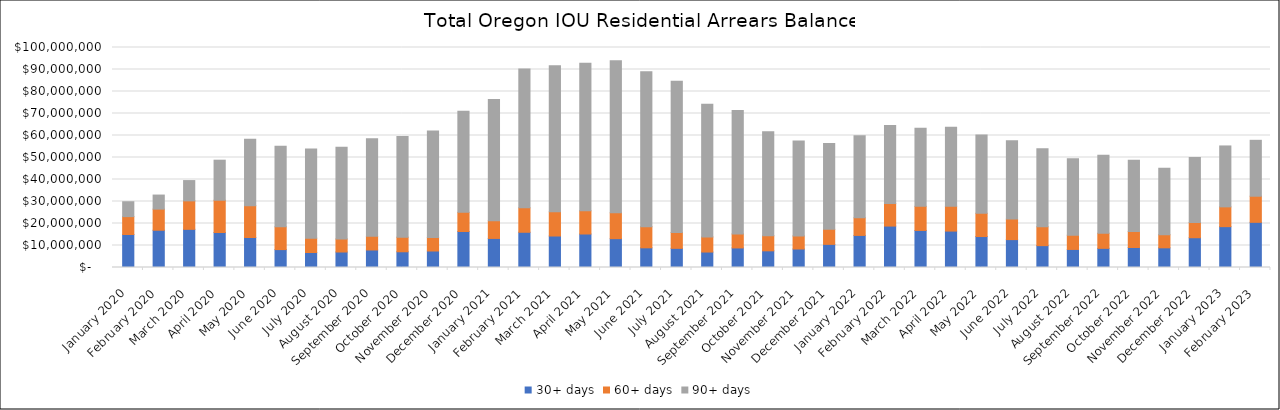
| Category | 30+ days | 60+ days | 90+ days |
|---|---|---|---|
| 2020-01-01 | 14999552.31 | 8129105.13 | 6760749.68 |
| 2020-02-01 | 16930804.68 | 9608883.66 | 6388004.87 |
| 2020-03-01 | 17347180.46 | 12945947.11 | 9217183.92 |
| 2020-04-01 | 15918330.54 | 14656978.15 | 18202643.15 |
| 2020-05-01 | 13635646.16 | 14480206.66 | 30139370.36 |
| 2020-06-01 | 8143670.76 | 10339556.26 | 36607516.53 |
| 2020-07-01 | 6807663.49 | 6543664.8 | 40561852.84 |
| 2020-08-01 | 7043775.37 | 5937688.4 | 41691741.28 |
| 2020-09-01 | 7956477.38 | 6224781.42 | 44287595.16 |
| 2020-10-01 | 7149177.07 | 6636657.67 | 45739306.85 |
| 2020-11-01 | 7497623.31 | 6094228.87 | 48474848.41 |
| 2020-12-01 | 16371314.19 | 8704218.41 | 45908006.23 |
| 2021-01-01 | 13214270.68 | 8037108.22 | 55068671.43 |
| 2021-02-01 | 16011404.93 | 11106234.59 | 63088549.71 |
| 2021-03-01 | 14313409.11 | 10974342.83 | 66427453.01 |
| 2021-04-01 | 15224391.09 | 10543368.48 | 67038804.29 |
| 2021-05-01 | 13112466.94 | 11746646.89 | 69161118.38 |
| 2021-06-01 | 8943344.88 | 9612007 | 70464497.39 |
| 2021-07-01 | 8703532.45 | 7212772.07 | 68735117.98 |
| 2021-08-01 | 7026542.74 | 6868356.15 | 60360404.25 |
| 2021-09-01 | 8888348.2 | 6358329.2 | 56065102.58 |
| 2021-10-01 | 7576302.48 | 6903840.03 | 47217260.64 |
| 2021-11-01 | 8405456.54 | 5953820.68 | 43106689.97 |
| 2021-12-01 | 10513420.18 | 6850234.63 | 38968877.75 |
| 2022-01-01 | 14579383.25 | 7984502.31 | 37359295.52 |
| 2022-02-01 | 18831589.01 | 10230930.47 | 35508913.88 |
| 2022-03-01 | 16842956.2 | 10953380.34 | 35495037.86 |
| 2022-04-01 | 16549452.8 | 11307328.46 | 35881294.34 |
| 2022-05-01 | 14072638.32 | 10575575.8 | 35576534.39 |
| 2022-06-01 | 12680004.88 | 9309011.72 | 35637289.62 |
| 2022-07-01 | 9934061.37 | 8573918.93 | 35516020.82 |
| 2022-08-01 | 8212808.61 | 6481031.94 | 34707437.92 |
| 2022-09-01 | 8707013.89 | 6849050.78 | 35497084.14 |
| 2022-10-01 | 9101780.56 | 7251245.34 | 32374097.64 |
| 2022-11-01 | 8939007.27 | 5977601.39 | 30173986.17 |
| 2022-12-01 | 13531988.3 | 6905091.03 | 29576466.56 |
| 2023-01-01 | 18567859.34 | 8991909.25 | 27691178.5 |
| 2023-02-01 | 20532858.19 | 11866651.07 | 25413417.4 |